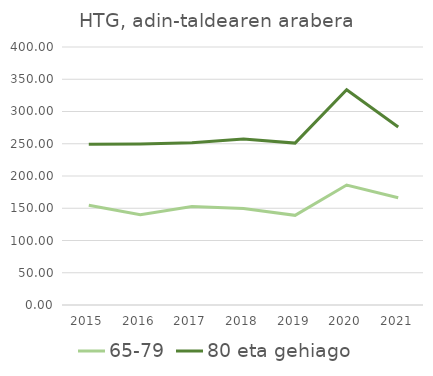
| Category | 65-79 | 80 eta gehiago |
|---|---|---|
| 2015.0 | 154.682 | 249.146 |
| 2016.0 | 139.955 | 249.636 |
| 2017.0 | 152.871 | 251.4 |
| 2018.0 | 149.472 | 257.247 |
| 2019.0 | 139.033 | 251.038 |
| 2020.0 | 185.976 | 333.6 |
| 2021.0 | 166.181 | 275.922 |